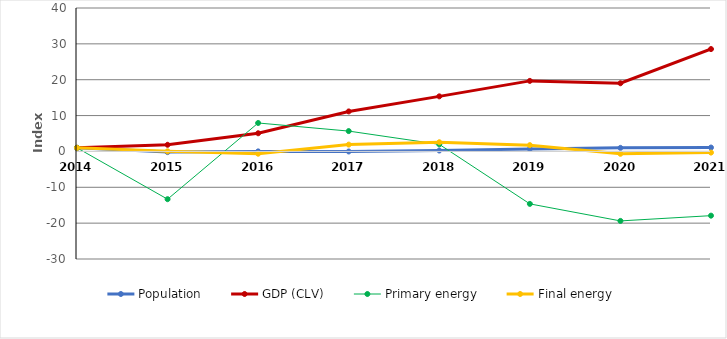
| Category | Population | GDP (CLV) | Primary energy | Final energy |
|---|---|---|---|---|
| 2014 | 1 | 1 | 1 | 1 |
| 2015 | -0.194 | 1.853 | -13.32 | 0.025 |
| 2016 | 0.009 | 5.067 | 7.931 | -0.637 |
| 2017 | -0.014 | 11.153 | 5.671 | 1.903 |
| 2018 | 0.252 | 15.359 | 1.974 | 2.559 |
| 2019 | 0.684 | 19.673 | -14.627 | 1.754 |
| 2020 | 0.993 | 19.014 | -19.378 | -0.66 |
| 2021 | 1.083 | 28.551 | -17.911 | -0.322 |